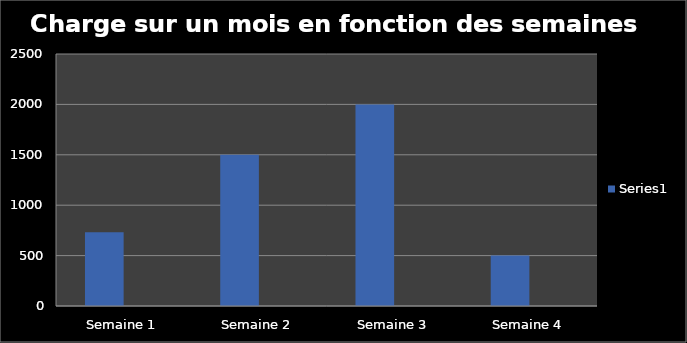
| Category | Series 0 | Series 1 |
|---|---|---|
| Semaine 1 | 732.1 |  |
| Semaine 2 | 1500 |  |
| Semaine 3 | 2000 |  |
| Semaine 4 | 500 |  |